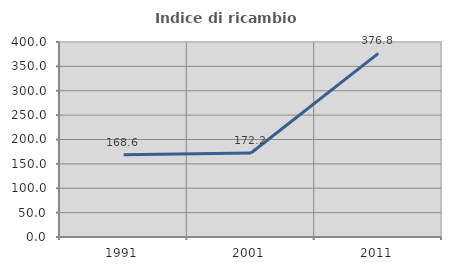
| Category | Indice di ricambio occupazionale  |
|---|---|
| 1991.0 | 168.571 |
| 2001.0 | 172.222 |
| 2011.0 | 376.786 |